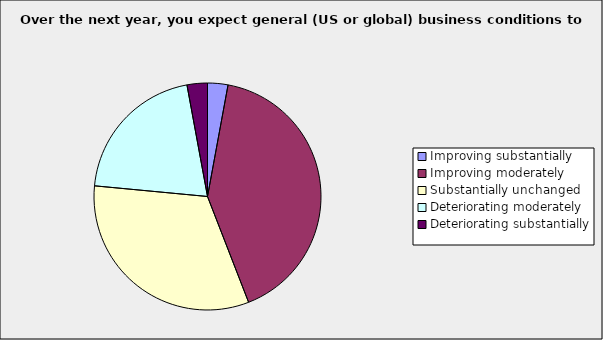
| Category | Series 0 |
|---|---|
| Improving substantially | 0.029 |
| Improving moderately | 0.412 |
| Substantially unchanged | 0.324 |
| Deteriorating moderately | 0.206 |
| Deteriorating substantially | 0.029 |